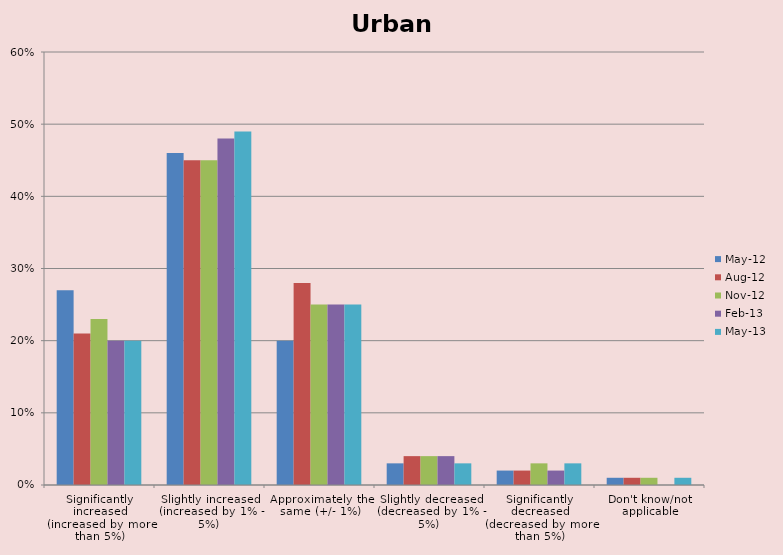
| Category | May-12 | Aug-12 | Nov-12 | Feb-13 | May-13 |
|---|---|---|---|---|---|
| Significantly increased (increased by more than 5%) | 0.27 | 0.21 | 0.23 | 0.2 | 0.2 |
| Slightly increased (increased by 1% - 5%) | 0.46 | 0.45 | 0.45 | 0.48 | 0.49 |
| Approximately the same (+/- 1%) | 0.2 | 0.28 | 0.25 | 0.25 | 0.25 |
| Slightly decreased (decreased by 1% - 5%) | 0.03 | 0.04 | 0.04 | 0.04 | 0.03 |
| Significantly decreased (decreased by more than 5%) | 0.02 | 0.02 | 0.03 | 0.02 | 0.03 |
| Don't know/not applicable | 0.01 | 0.01 | 0.01 | 0 | 0.01 |